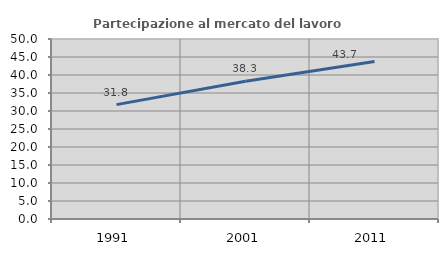
| Category | Partecipazione al mercato del lavoro  femminile |
|---|---|
| 1991.0 | 31.77 |
| 2001.0 | 38.283 |
| 2011.0 | 43.72 |